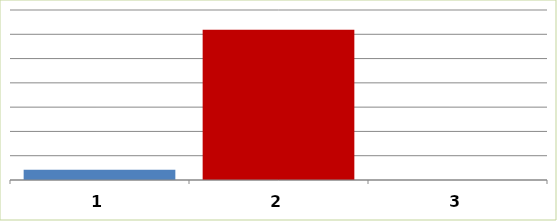
| Category | Series 0 |
|---|---|
| 0 | 2112398 |
| 1 | 30939461 |
| 2 | 0 |